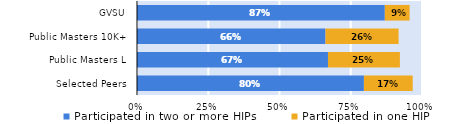
| Category | Participated in two or more HIPs | Participated in one HIP |
|---|---|---|
| Selected Peers | 0.796 | 0.171 |
| Public Masters L | 0.67 | 0.252 |
| Public Masters 10K+ | 0.661 | 0.256 |
| GVSU | 0.87 | 0.087 |